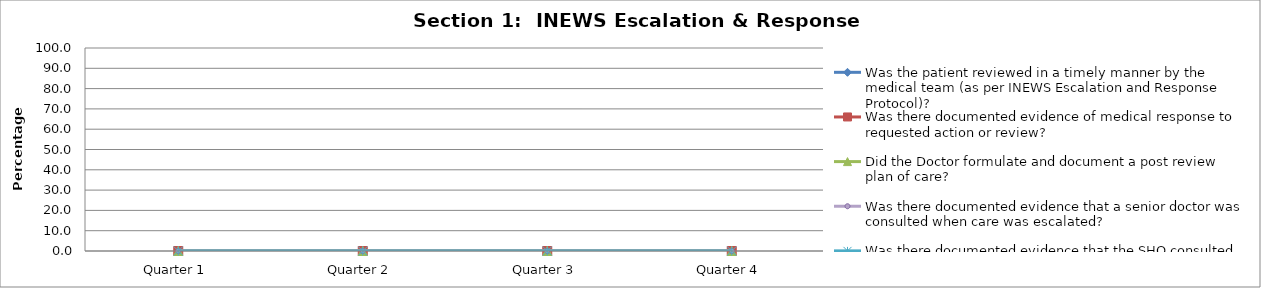
| Category | Was the patient reviewed in a timely manner by the medical team (as per INEWS Escalation and Response Protocol)? | Was there documented evidence of medical response to requested action or review? | Did the Doctor formulate and document a post review plan of care? | Was there documented evidence that a senior doctor was consulted when care was escalated? | Was there documented evidence that the SHO consulted with a Registrar if no response to treatment? |
|---|---|---|---|---|---|
| Quarter 1 | 0 | 0 | 0 | 0 | 0 |
| Quarter 2 | 0 | 0 | 0 | 0 | 0 |
| Quarter 3 | 0 | 0 | 0 | 0 | 0 |
| Quarter 4 | 0 | 0 | 0 | 0 | 0 |